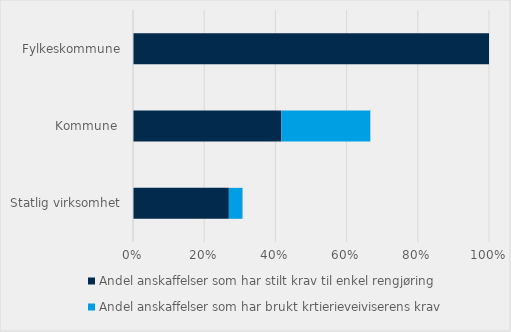
| Category | Andel anskaffelser som har stilt krav til enkel rengjøring | Andel anskaffelser som har brukt krtierieveiviserens krav |
|---|---|---|
| Statlig virksomhet | 0.269 | 0.038 |
| Kommune  | 0.417 | 0.25 |
| Fylkeskommune | 1 | 0 |